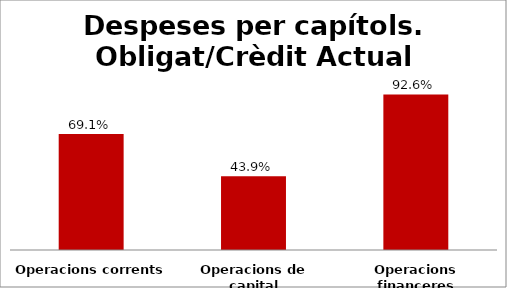
| Category | Series 0 |
|---|---|
| Operacions corrents | 0.691 |
| Operacions de capital | 0.439 |
| Operacions financeres | 0.926 |